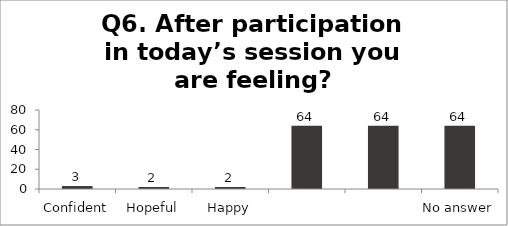
| Category | Q6. After participation in today’s session you are feeling? |
|---|---|
| Confident | 3 |
| Hopeful | 2 |
| Happy | 2 |
|  | 64 |
|  | 64 |
| No answer | 64 |